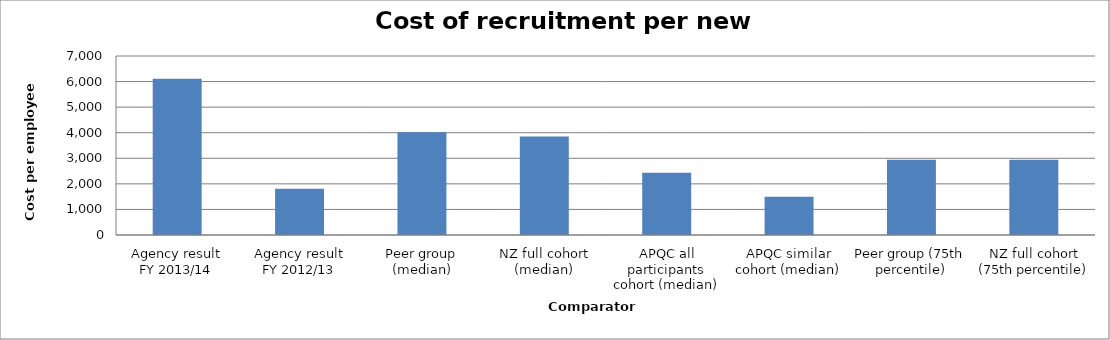
| Category | Result |
|---|---|
| Agency result
FY 2013/14 | 6107.345 |
| Agency result
FY 2012/13 | 1808.511 |
| Peer group (median) | 4022.578 |
| NZ full cohort (median) | 3855.62 |
| APQC all participants cohort (median) | 2434.05 |
| APQC similar cohort (median) | 1500 |
| Peer group (75th percentile) | 2941.091 |
| NZ full cohort (75th percentile) | 2941.091 |